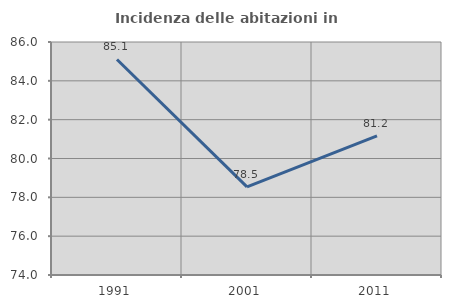
| Category | Incidenza delle abitazioni in proprietà  |
|---|---|
| 1991.0 | 85.101 |
| 2001.0 | 78.539 |
| 2011.0 | 81.17 |